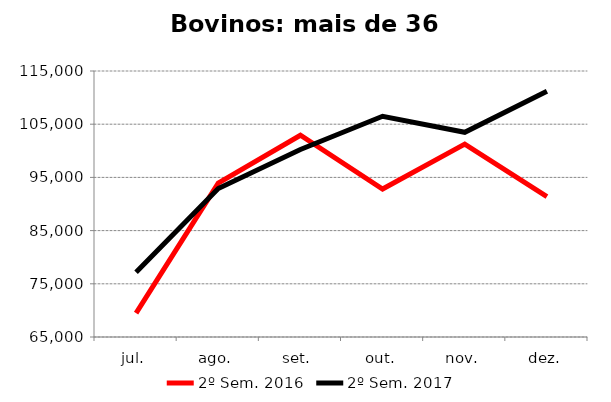
| Category | 2º Sem. 2016 | 2º Sem. 2017 |
|---|---|---|
| jul. | 69482 | 77184 |
| ago. | 93923 | 92916 |
| set. | 102929 | 100247 |
| out. | 92818 | 106486 |
| nov. | 101247 | 103478 |
| dez. | 91368 | 111211 |